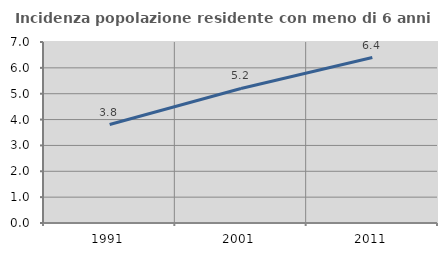
| Category | Incidenza popolazione residente con meno di 6 anni |
|---|---|
| 1991.0 | 3.808 |
| 2001.0 | 5.204 |
| 2011.0 | 6.399 |